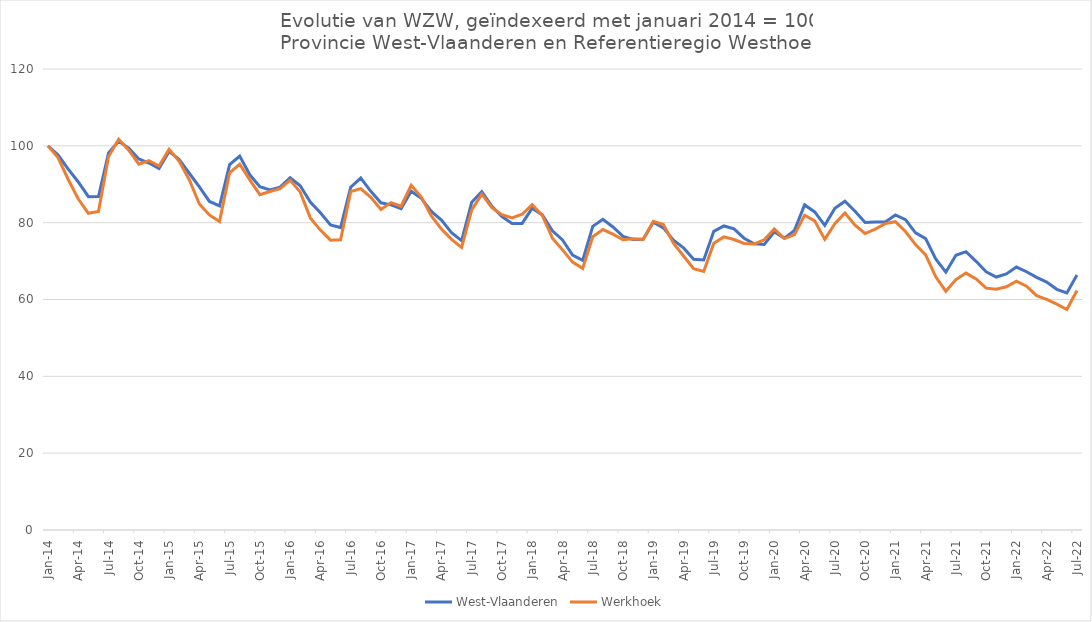
| Category | West-Vlaanderen | Werkhoek |
|---|---|---|
| 2014-01-01 | 100 | 100 |
| 2014-02-01 | 97.599 | 96.896 |
| 2014-03-01 | 93.954 | 91.238 |
| 2014-04-01 | 90.592 | 86.146 |
| 2014-05-01 | 86.775 | 82.428 |
| 2014-06-01 | 86.805 | 82.913 |
| 2014-07-01 | 98.144 | 97.203 |
| 2014-08-01 | 101.213 | 101.714 |
| 2014-09-01 | 99.4 | 98.852 |
| 2014-10-01 | 96.598 | 95.231 |
| 2014-11-01 | 95.517 | 96.169 |
| 2014-12-01 | 94.084 | 94.73 |
| 2015-01-01 | 98.544 | 99.079 |
| 2015-02-01 | 96.415 | 95.959 |
| 2015-03-01 | 92.866 | 91.19 |
| 2015-04-01 | 89.299 | 84.869 |
| 2015-05-01 | 85.519 | 82.008 |
| 2015-06-01 | 84.341 | 80.31 |
| 2015-07-01 | 95.117 | 92.984 |
| 2015-08-01 | 97.351 | 95.231 |
| 2015-09-01 | 92.458 | 91.157 |
| 2015-10-01 | 89.351 | 87.278 |
| 2015-11-01 | 88.513 | 88.118 |
| 2015-12-01 | 89.236 | 88.862 |
| 2016-01-01 | 91.693 | 91.077 |
| 2016-02-01 | 89.594 | 87.941 |
| 2016-03-01 | 85.381 | 81.248 |
| 2016-04-01 | 82.592 | 78.063 |
| 2016-05-01 | 79.415 | 75.445 |
| 2016-06-01 | 78.727 | 75.558 |
| 2016-07-01 | 89.231 | 88.07 |
| 2016-08-01 | 91.612 | 88.846 |
| 2016-09-01 | 88.16 | 86.583 |
| 2016-10-01 | 85.181 | 83.446 |
| 2016-11-01 | 84.641 | 85.225 |
| 2016-12-01 | 83.665 | 84.271 |
| 2017-01-01 | 88.198 | 89.735 |
| 2017-02-01 | 86.327 | 86.68 |
| 2017-03-01 | 82.947 | 81.781 |
| 2017-04-01 | 80.661 | 78.322 |
| 2017-05-01 | 77.419 | 75.639 |
| 2017-06-01 | 75.295 | 73.537 |
| 2017-07-01 | 85.299 | 83.333 |
| 2017-08-01 | 88.055 | 87.423 |
| 2017-09-01 | 84.278 | 83.883 |
| 2017-10-01 | 81.576 | 82.089 |
| 2017-11-01 | 79.79 | 81.248 |
| 2017-12-01 | 79.808 | 82.186 |
| 2018-01-01 | 83.77 | 84.691 |
| 2018-02-01 | 82.017 | 81.862 |
| 2018-03-01 | 77.859 | 75.978 |
| 2018-04-01 | 75.488 | 72.923 |
| 2018-05-01 | 71.558 | 69.722 |
| 2018-06-01 | 70.2 | 68.105 |
| 2018-07-01 | 79.047 | 76.35 |
| 2018-08-01 | 80.879 | 78.209 |
| 2018-09-01 | 78.88 | 76.996 |
| 2018-10-01 | 76.436 | 75.542 |
| 2018-11-01 | 75.605 | 75.784 |
| 2018-12-01 | 75.663 | 75.655 |
| 2019-01-01 | 80.096 | 80.359 |
| 2019-02-01 | 78.647 | 79.502 |
| 2019-03-01 | 75.435 | 74.652 |
| 2019-04-01 | 73.432 | 71.322 |
| 2019-05-01 | 70.467 | 68.008 |
| 2019-06-01 | 70.275 | 67.313 |
| 2019-07-01 | 77.739 | 74.652 |
| 2019-08-01 | 79.145 | 76.301 |
| 2019-09-01 | 78.385 | 75.622 |
| 2019-10-01 | 75.951 | 74.588 |
| 2019-11-01 | 74.49 | 74.475 |
| 2019-12-01 | 74.335 | 75.525 |
| 2020-01-01 | 77.604 | 78.387 |
| 2020-02-01 | 75.986 | 75.849 |
| 2020-03-01 | 77.999 | 76.899 |
| 2020-04-01 | 84.621 | 81.927 |
| 2020-05-01 | 82.792 | 80.472 |
| 2020-06-01 | 79.3 | 75.655 |
| 2020-07-01 | 83.765 | 79.712 |
| 2020-08-01 | 85.591 | 82.525 |
| 2020-09-01 | 82.967 | 79.357 |
| 2020-10-01 | 80.061 | 77.174 |
| 2020-11-01 | 80.173 | 78.322 |
| 2020-12-01 | 80.203 | 79.745 |
| 2021-01-01 | 82.009 | 80.246 |
| 2021-02-01 | 80.771 | 77.708 |
| 2021-03-01 | 77.344 | 74.281 |
| 2021-04-01 | 75.848 | 71.613 |
| 2021-05-01 | 70.54 | 65.907 |
| 2021-06-01 | 67.12 | 62.156 |
| 2021-07-01 | 71.525 | 65.196 |
| 2021-08-01 | 72.451 | 66.877 |
| 2021-09-01 | 69.937 | 65.341 |
| 2021-10-01 | 67.208 | 62.949 |
| 2021-11-01 | 65.847 | 62.674 |
| 2021-12-01 | 66.65 | 63.32 |
| 2022-01-01 | 68.446 | 64.791 |
| 2022-02-01 | 67.23 | 63.482 |
| 2022-03-01 | 65.762 | 60.993 |
| 2022-04-01 | 64.544 | 60.023 |
| 2022-05-01 | 62.645 | 58.794 |
| 2022-06-01 | 61.71 | 57.388 |
| 2022-07-01 | 66.355 | 62.35 |